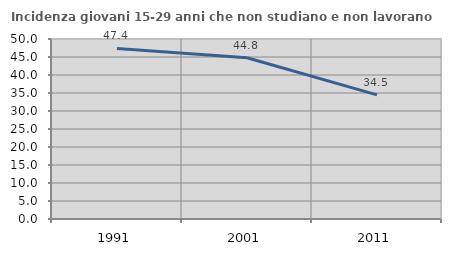
| Category | Incidenza giovani 15-29 anni che non studiano e non lavorano  |
|---|---|
| 1991.0 | 47.368 |
| 2001.0 | 44.776 |
| 2011.0 | 34.481 |